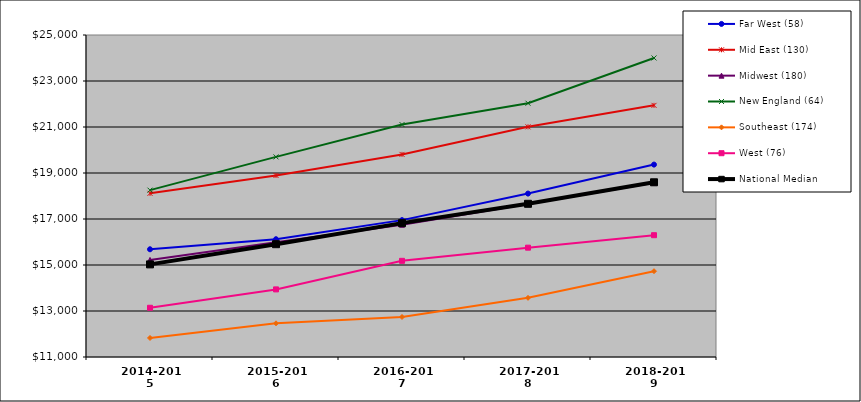
| Category | Far West (58) | Mid East (130) | Midwest (180) | New England (64) | Southeast (174) | West (76) | National Median |
|---|---|---|---|---|---|---|---|
| 2014-2015 | 15684 | 18116 | 15221 | 18254 | 11827 | 13140 | 15026.5 |
| 2015-2016 | 16120.5 | 18892.5 | 15986 | 19700 | 12464.5 | 13939.5 | 15904.5 |
| 2016-2017 | 16950.5 | 19809 | 16749 | 21105.5 | 12740 | 15181 | 16820.5 |
| 2017-2018 | 18105.5 | 21006.5 | 17656.5 | 22033.5 | 13572.5 | 15753.5 | 17661 |
| 2018-2019 | 19365.5 | 21941 | 18573 | 24001.5 | 14730.5 | 16296 | 18596 |